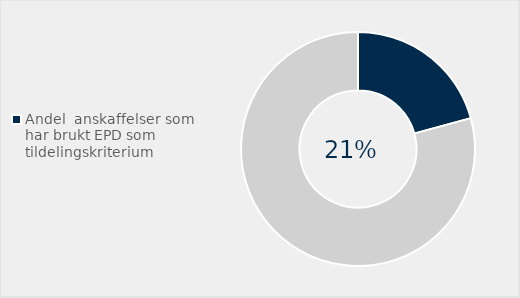
| Category | Series 0 |
|---|---|
| Andel  anskaffelser som har brukt EPD som tildelingskriterium | 0.208 |
| Ikke brukt miljø miljø som tildelingskritierum | 0.792 |